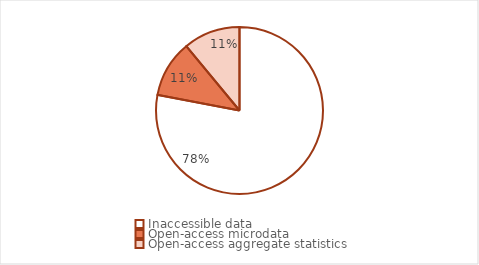
| Category | Percentage |
|---|---|
| Inaccessible data | 0.78 |
| Open-access microdata | 0.11 |
| Open-access aggregate statistics | 0.11 |